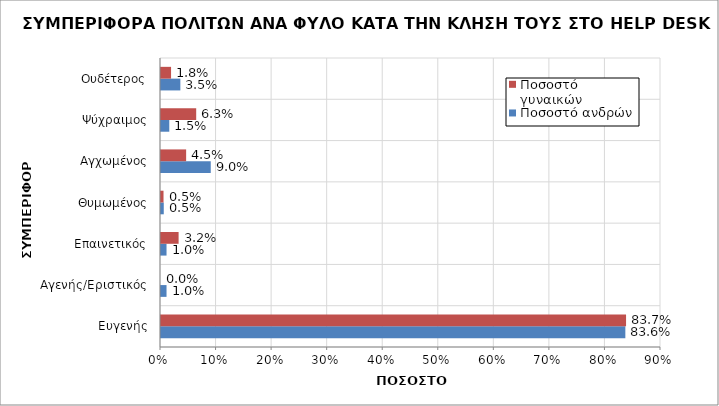
| Category | Ποσοστό ανδρών | Ποσοστό γυναικών |
|---|---|---|
| Ευγενής | 0.836 | 0.837 |
| Αγενής/Εριστικός | 0.01 | 0 |
| Επαινετικός | 0.01 | 0.032 |
| Θυμωμένος | 0.005 | 0.005 |
| Αγχωμένος | 0.09 | 0.045 |
| Ψύχραιμος | 0.015 | 0.063 |
| Ουδέτερος | 0.035 | 0.018 |